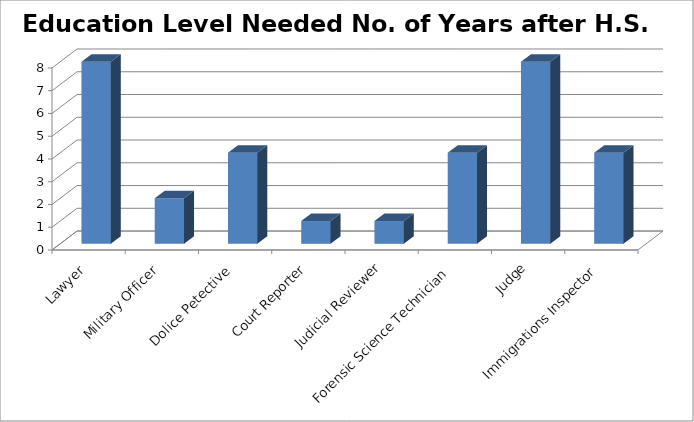
| Category | Education Level Needed No. of Years after H.S. |
|---|---|
| Lawyer | 8 |
| Military Officer | 2 |
| Dolice Petective | 4 |
| Court Reporter | 1 |
| Judicial Reviewer | 1 |
| Forensic Science Technician | 4 |
| Judge | 8 |
| Immigrations Inspector | 4 |